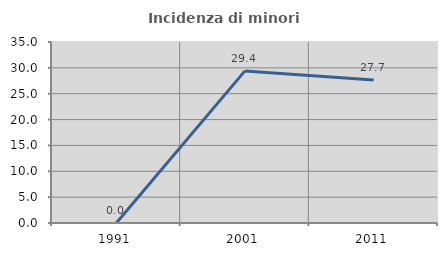
| Category | Incidenza di minori stranieri |
|---|---|
| 1991.0 | 0 |
| 2001.0 | 29.412 |
| 2011.0 | 27.66 |